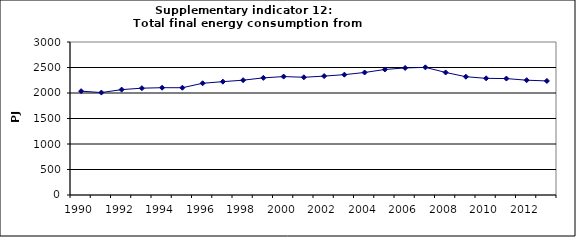
| Category | Total final energy consumption from transport, PJ |
|---|---|
| 1990 | 2036.25 |
| 1991 | 2008.534 |
| 1992 | 2066.395 |
| 1993 | 2094.405 |
| 1994 | 2103.993 |
| 1995 | 2103.365 |
| 1996 | 2190.592 |
| 1997 | 2222.459 |
| 1998 | 2251.326 |
| 1999 | 2296.589 |
| 2000 | 2322.046 |
| 2001 | 2308.488 |
| 2002 | 2331.413 |
| 2003 | 2359.923 |
| 2004 | 2402.141 |
| 2005 | 2461.552 |
| 2006 | 2491.207 |
| 2007 | 2502.489 |
| 2008 | 2402.905 |
| 2009 | 2319.178 |
| 2010 | 2287.519 |
| 2011 | 2282.812 |
| 2012 | 2251.198 |
| 2013 | 2236.5 |